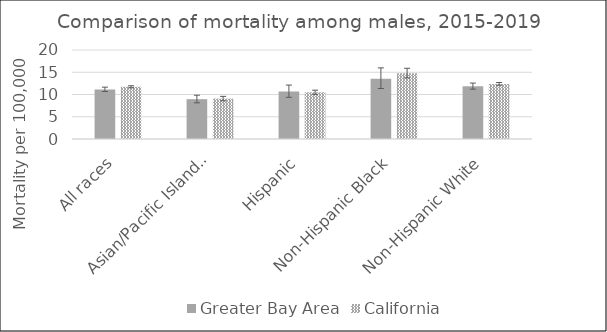
| Category | Greater Bay Area | California | US Mortality |
|---|---|---|---|
| All races | 11.15 | 11.73 |  |
| Asian/Pacific Islander | 8.95 | 9.08 |  |
| Hispanic | 10.69 | 10.49 |  |
| Non-Hispanic Black | 13.52 | 14.78 |  |
| Non-Hispanic White | 11.87 | 12.38 |  |